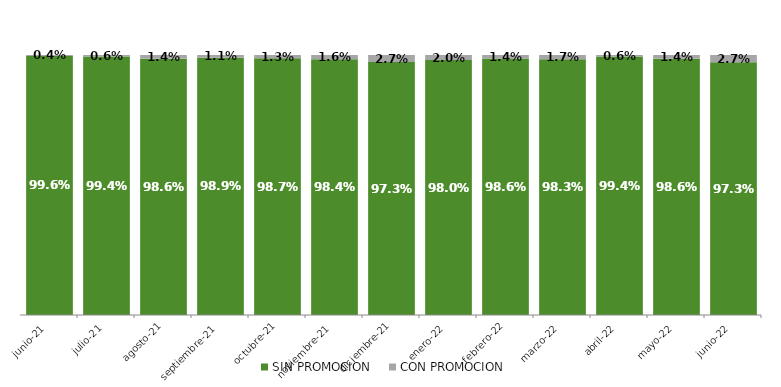
| Category | SIN PROMOCION   | CON PROMOCION   |
|---|---|---|
| 2021-06-01 | 0.996 | 0.004 |
| 2021-07-01 | 0.994 | 0.006 |
| 2021-08-01 | 0.986 | 0.014 |
| 2021-09-01 | 0.989 | 0.011 |
| 2021-10-01 | 0.987 | 0.013 |
| 2021-11-01 | 0.984 | 0.016 |
| 2021-12-01 | 0.973 | 0.027 |
| 2022-01-01 | 0.98 | 0.02 |
| 2022-02-01 | 0.986 | 0.014 |
| 2022-03-01 | 0.983 | 0.017 |
| 2022-04-01 | 0.994 | 0.006 |
| 2022-05-01 | 0.986 | 0.014 |
| 2022-06-01 | 0.973 | 0.027 |